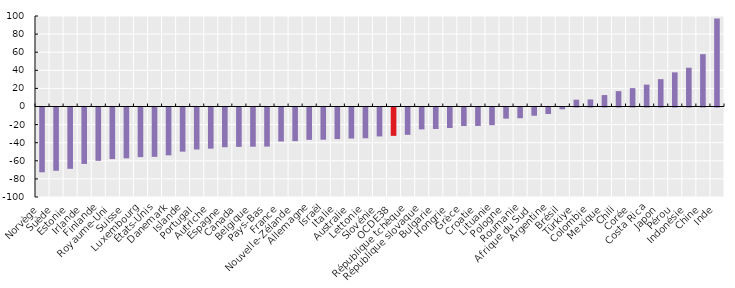
| Category | Series 0 |
|---|---|
| Norvège | -71.602 |
| Suède | -69.936 |
| Estonie | -67.773 |
| Irlande | -62.391 |
| Finlande | -58.925 |
| Royaume-Uni | -57.018 |
| Suisse | -56.168 |
| Luxembourg | -54.82 |
| États-Unis | -54.528 |
| Danemark | -52.857 |
| Islande | -48.793 |
| Portugal | -46.43 |
| Autriche | -45.484 |
| Espagne | -43.906 |
| Canada | -43.529 |
| Belgique | -43.348 |
| Pays-Bas | -43.222 |
| France | -37.6 |
| Nouvelle-Zélande | -37.189 |
| Allemagne | -35.768 |
| Israël | -35.634 |
| Italie | -34.925 |
| Australie | -34.285 |
| Lettonie | -34.017 |
| Slovénie | -31.97 |
| OCDE38 | -31.34 |
| République tchèque | -30.205 |
| République slovaque | -24.185 |
| Bulgarie | -23.771 |
| Hongrie | -22.67 |
| Grèce | -20.479 |
| Croatie | -20.387 |
| Lituanie | -19.508 |
| Pologne | -12.307 |
| Roumanie | -11.886 |
| Afrique du Sud | -9.117 |
| Argentine | -7.185 |
| Brésil | -2.01 |
| Türkiye | 7.518 |
| Colombie | 7.809 |
| Mexique | 12.666 |
| Chili | 17.002 |
| Corée | 20.305 |
| Costa Rica | 24.177 |
| Japon | 30.221 |
| Pérou | 37.732 |
| Indonésie | 42.848 |
| Chine | 57.823 |
| Inde | 97.203 |